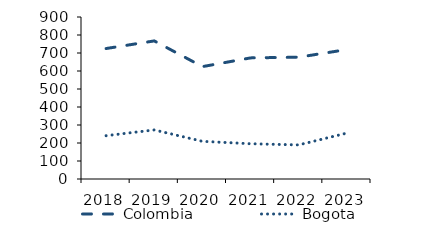
| Category | Colombia | Bogota |
|---|---|---|
| 2018.0 | 724.812 | 240.653 |
| 2019.0 | 767.141 | 272.642 |
| 2020.0 | 624.236 | 209.284 |
| 2021.0 | 672.843 | 195.816 |
| 2022.0 | 676.672 | 189.373 |
| 2023.0 | 719.227 | 255.188 |